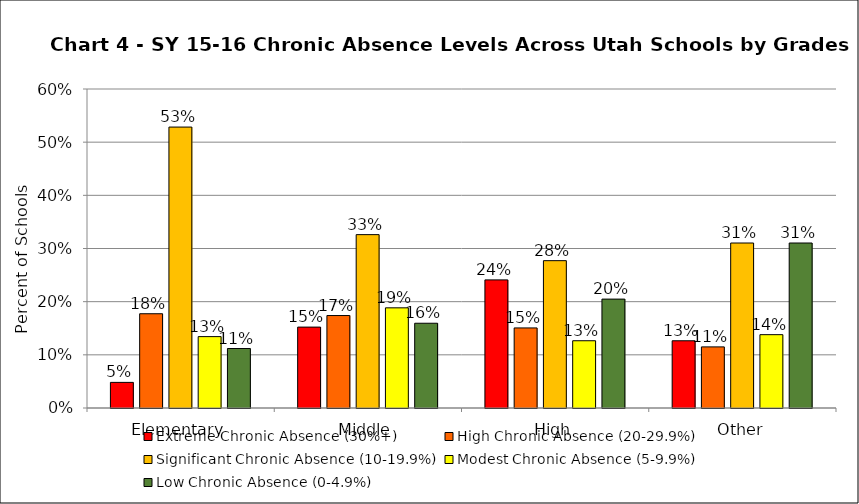
| Category | Extreme Chronic Absence (30%+) | High Chronic Absence (20-29.9%) | Significant Chronic Absence (10-19.9%) | Modest Chronic Absence (5-9.9%) | Low Chronic Absence (0-4.9%) |
|---|---|---|---|---|---|
| 0 | 0.048 | 0.177 | 0.528 | 0.134 | 0.112 |
| 1 | 0.152 | 0.174 | 0.326 | 0.188 | 0.159 |
| 2 | 0.241 | 0.151 | 0.277 | 0.127 | 0.205 |
| 3 | 0.126 | 0.115 | 0.31 | 0.138 | 0.31 |